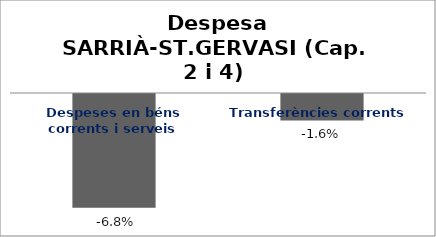
| Category | Series 0 |
|---|---|
| Despeses en béns corrents i serveis | -0.068 |
| Transferències corrents | -0.016 |